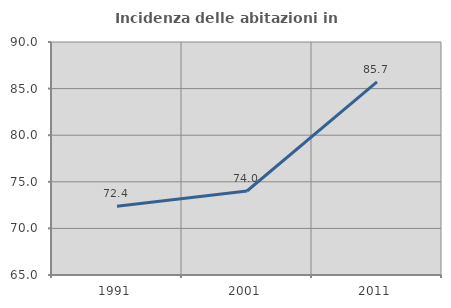
| Category | Incidenza delle abitazioni in proprietà  |
|---|---|
| 1991.0 | 72.374 |
| 2001.0 | 74.013 |
| 2011.0 | 85.714 |